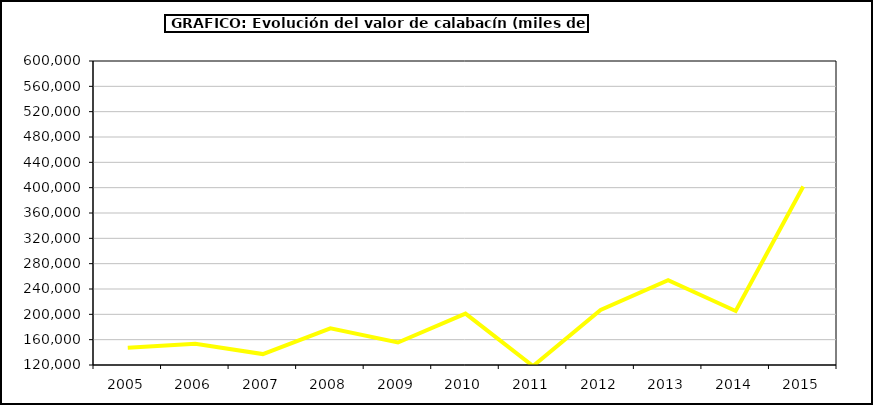
| Category | Valor |
|---|---|
| 2005.0 | 147357.877 |
| 2006.0 | 153425.95 |
| 2007.0 | 137236.942 |
| 2008.0 | 177885.879 |
| 2009.0 | 155520.785 |
| 2010.0 | 201170.752 |
| 2011.0 | 118311.354 |
| 2012.0 | 207035.363 |
| 2013.0 | 253994.073 |
| 2014.0 | 205307.232 |
| 2015.0 | 401801.34 |